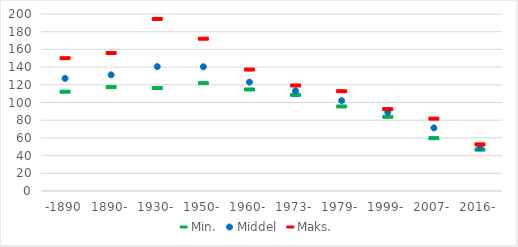
| Category | Min. | Middel | Maks. |
|---|---|---|---|
| -1890 | 112.777 | 127.225 | 150.641 |
| 1890- | 117.973 | 131.252 | 156.478 |
| 1930- | 116.932 | 140.56 | 194.976 |
| 1950- | 122.428 | 140.392 | 172.659 |
| 1960- | 115.272 | 123.073 | 137.814 |
| 1973- | 109.056 | 113.138 | 119.817 |
| 1979- | 96.096 | 102.085 | 113.301 |
| 1999- | 84.421 | 88.954 | 93.072 |
| 2007- | 60.289 | 71.293 | 82.306 |
| 2016- | 47.316 | 48.893 | 53.225 |